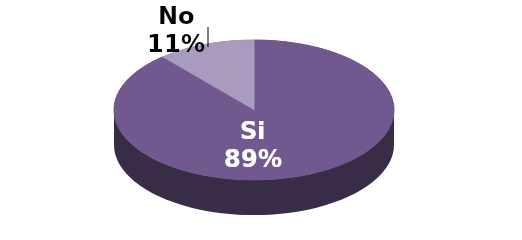
| Category | Series 1 |
|---|---|
| Si | 125 |
| No | 16 |